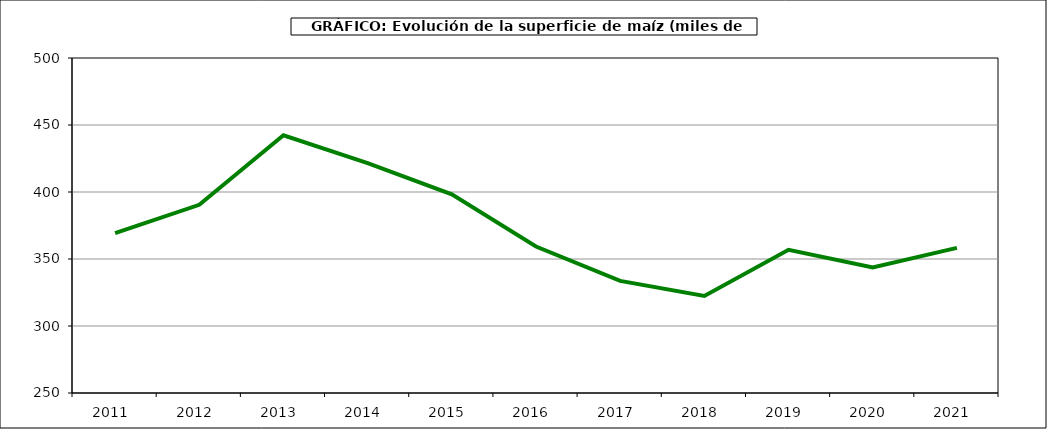
| Category | Superficie |
|---|---|
| 2011.0 | 369.264 |
| 2012.0 | 390.433 |
| 2013.0 | 442.298 |
| 2014.0 | 421.605 |
| 2015.0 | 398.257 |
| 2016.0 | 359.275 |
| 2017.0 | 333.628 |
| 2018.0 | 322.373 |
| 2019.0 | 356.825 |
| 2020.0 | 343.778 |
| 2021.0 | 358.269 |